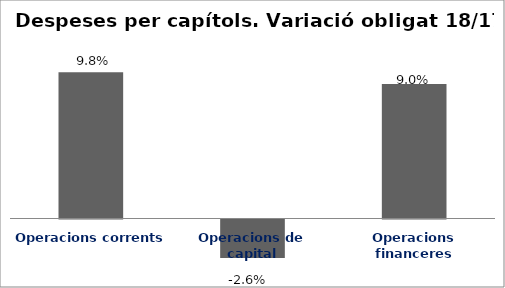
| Category | Series 0 |
|---|---|
| Operacions corrents | 0.098 |
| Operacions de capital | -0.026 |
| Operacions financeres | 0.09 |